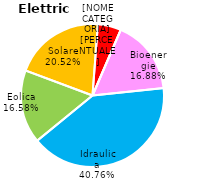
| Category | Series 0 |
|---|---|
| Idraulica | 40.758 |
| Eolica | 16.581 |
| Solare | 20.52 |
| Geotermica | 5.258 |
| Rifiuti | 0 |
| Bioenergie | 16.873 |